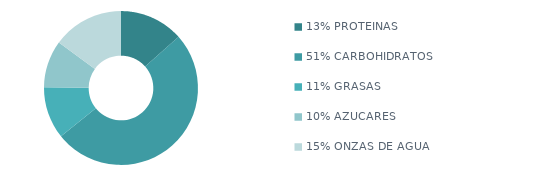
| Category | Series 0 |
|---|---|
| 13% PROTEÍNAS | 915 |
| 51% CARBOHIDRATOS | 3460 |
| 11% GRASAS | 745 |
| 10% AZÚCARES | 675 |
| 15% ONZAS DE AGUA | 1018 |